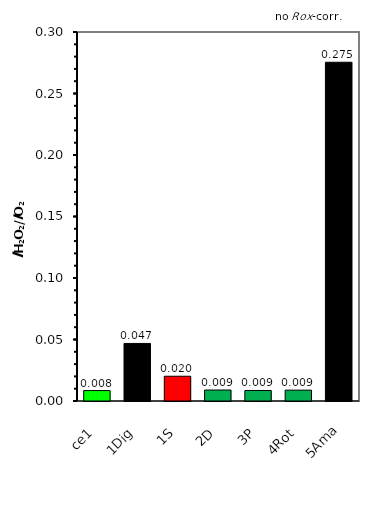
| Category | no ROX-corr. |
|---|---|
| ce1 | 0.008 |
| 1Dig | 0.047 |
| 1S | 0.02 |
| 2D | 0.009 |
| 3P | 0.009 |
| 4Rot | 0.009 |
| 5Ama | 0.275 |